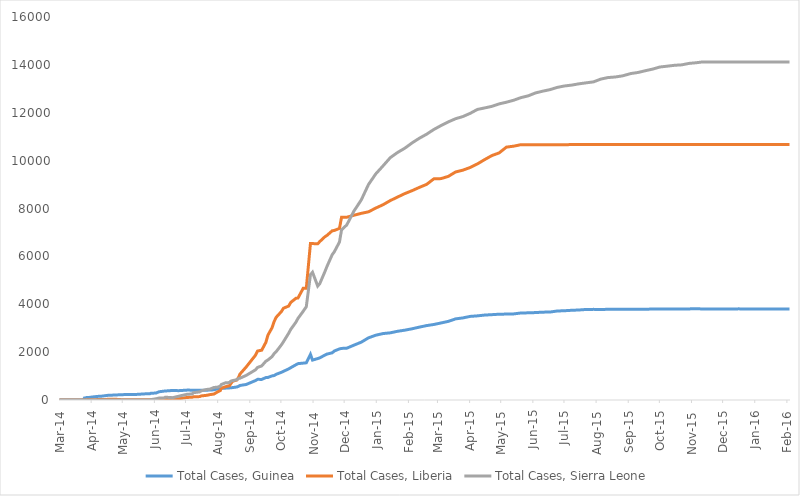
| Category | Total Cases, Guinea | Total Cases, Liberia | Total Cases, Sierra Leone |
|---|---|---|---|
| 2014-03-01 | 0 | 0 | 0 |
| 2014-03-02 | 0 | 0 | 0 |
| 2014-03-03 | 0 | 0 | 0 |
| 2014-03-04 | 0 | 0 | 0 |
| 2014-03-05 | 0 | 0 | 0 |
| 2014-03-06 | 0 | 0 | 0 |
| 2014-03-07 | 0 | 0 | 0 |
| 2014-03-08 | 0 | 0 | 0 |
| 2014-03-09 | 0 | 0 | 0 |
| 2014-03-10 | 0 | 0 | 0 |
| 2014-03-11 | 0 | 0 | 0 |
| 2014-03-12 | 0 | 0 | 0 |
| 2014-03-13 | 0 | 0 | 0 |
| 2014-03-14 | 0 | 0 | 0 |
| 2014-03-15 | 0 | 0 | 0 |
| 2014-03-16 | 0 | 0 | 0 |
| 2014-03-17 | 0 | 0 | 0 |
| 2014-03-18 | 0 | 0 | 0 |
| 2014-03-19 | 0 | 0 | 0 |
| 2014-03-20 | 0 | 0 | 0 |
| 2014-03-21 | 0 | 0 | 0 |
| 2014-03-22 | 0 | 0 | 0 |
| 2014-03-23 | 0 | 0 | 0 |
| 2014-03-24 | 0 | 0 | 0 |
| 2014-03-25 | 86 | 0 | 0 |
| 2014-03-26 | 86 | 0 | 0 |
| 2014-03-27 | 103 | 8 | 6 |
| 2014-03-31 | 112 | 8 | 0 |
| 2014-04-01 | 122 | 8 | 0 |
| 2014-04-02 | 127 | 8 | 0 |
| 2014-04-07 | 151 | 18 | 0 |
| 2014-04-10 | 157 | 22 | 0 |
| 2014-04-17 | 197 | 27 | 0 |
| 2014-04-21 | 203 | 27 | 0 |
| 2014-04-23 | 208 | 34 | 0 |
| 2014-04-30 | 221 | 13 | 0 |
| 2014-05-05 | 231 | 13 | 0 |
| 2014-05-14 | 233 | 12 | 0 |
| 2014-05-23 | 258 | 12 | 0 |
| 2014-05-27 | 258 | 12 | 1 |
| 2014-05-28 | 281 | 12 | 16 |
| 2014-06-02 | 291 | 13 | 50 |
| 2014-06-05 | 344 | 13 | 81 |
| 2014-06-10 | 372 | 15 | 89 |
| 2014-06-11 | 376 | 15 | 117 |
| 2014-06-18 | 398 | 33 | 97 |
| 2014-06-24 | 390 | 51 | 158 |
| 2014-07-02 | 413 | 107 | 239 |
| 2014-07-07 | 412 | 115 | 252 |
| 2014-07-08 | 408 | 131 | 305 |
| 2014-07-14 | 409 | 142 | 337 |
| 2014-07-16 | 406 | 172 | 386 |
| 2014-07-21 | 410 | 196 | 442 |
| 2014-07-24 | 415 | 224 | 454 |
| 2014-07-28 | 427 | 249 | 525 |
| 2014-07-31 | 460 | 329 | 533 |
| 2014-08-03 | 472 | 391 | 574 |
| 2014-08-04 | 485 | 486 | 646 |
| 2014-08-08 | 495 | 554 | 717 |
| 2014-08-12 | 506 | 599 | 730 |
| 2014-08-13 | 510 | 670 | 783 |
| 2014-08-15 | 519 | 786 | 810 |
| 2014-08-19 | 543 | 834 | 848 |
| 2014-08-21 | 579 | 972 | 907 |
| 2014-08-22 | 607 | 1082 | 910 |
| 2014-08-28 | 648 | 1378 | 1026 |
| 2014-09-06 | 812 | 1871 | 1261 |
| 2014-09-08 | 862 | 2046 | 1361 |
| 2014-09-12 | 861 | 2081 | 1424 |
| 2014-09-16 | 936 | 2407 | 1620 |
| 2014-09-18 | 942 | 2710 | 1673 |
| 2014-09-22 | 1008 | 3022 | 1813 |
| 2014-09-24 | 1022 | 3280 | 1940 |
| 2014-09-26 | 1074 | 3458 | 2021 |
| 2014-10-01 | 1157 | 3696 | 2304 |
| 2014-10-03 | 1199 | 3834 | 2437 |
| 2014-10-08 | 1298 | 3924 | 2789 |
| 2014-10-10 | 1350 | 4076 | 2950 |
| 2014-10-15 | 1472 | 4249 | 3252 |
| 2014-10-17 | 1519 | 4262 | 3410 |
| 2014-10-22 | 1540 | 4665 | 3706 |
| 2014-10-25 | 1553 | 4665 | 3896 |
| 2014-10-29 | 1906 | 6535 | 5235 |
| 2014-10-31 | 1667 | 6535 | 5338 |
| 2014-11-05 | 1731 | 6525 | 4759 |
| 2014-11-07 | 1760 | 6619 | 4862 |
| 2014-11-12 | 1878 | 6822 | 5368 |
| 2014-11-14 | 1919 | 6878 | 5586 |
| 2014-11-19 | 1971 | 7069 | 6073 |
| 2014-11-21 | 2047 | 7082 | 6190 |
| 2014-11-26 | 2134 | 7168 | 6599 |
| 2014-11-28 | 2155 | 7635 | 7109 |
| 2014-12-03 | 2164 | 7635 | 7312 |
| 2014-12-10 | 2292 | 7719 | 7897 |
| 2014-12-17 | 2416 | 7797 | 8356 |
| 2014-12-24 | 2597 | 7862 | 9004 |
| 2014-12-31 | 2707 | 8018 | 9446 |
| 2015-01-07 | 2775 | 8157 | 9780 |
| 2015-01-14 | 2806 | 8331 | 10124 |
| 2015-01-21 | 2871 | 8478 | 10340 |
| 2015-01-28 | 2917 | 8622 | 10518 |
| 2015-02-04 | 2975 | 8745 | 10740 |
| 2015-02-11 | 3044 | 8881 | 10934 |
| 2015-02-18 | 3108 | 9007 | 11103 |
| 2015-02-25 | 3155 | 9238 | 11301 |
| 2015-03-04 | 3219 | 9249 | 11466 |
| 2015-03-11 | 3285 | 9343 | 11619 |
| 2015-03-18 | 3389 | 9526 | 11751 |
| 2015-03-25 | 3429 | 9602 | 11841 |
| 2015-04-01 | 3492 | 9712 | 11974 |
| 2015-04-08 | 3515 | 9862 | 12138 |
| 2015-04-15 | 3548 | 10042 | 12201 |
| 2015-04-22 | 3565 | 10212 | 12267 |
| 2015-04-29 | 3584 | 10322 | 12371 |
| 2015-05-06 | 3589 | 10564 | 12440 |
| 2015-05-13 | 3597 | 10604 | 12523 |
| 2015-05-20 | 3635 | 10666 | 12632 |
| 2015-05-27 | 3641 | 10666 | 12706 |
| 2015-06-03 | 3652 | 10666 | 12827 |
| 2015-06-10 | 3670 | 10666 | 12901 |
| 2015-06-17 | 3674 | 10666 | 12965 |
| 2015-06-24 | 3718 | 10666 | 13059 |
| 2015-07-01 | 3729 | 10666 | 13119 |
| 2015-07-08 | 3748 | 10670 | 13155 |
| 2015-07-15 | 3760 | 10673 | 13209 |
| 2015-07-22 | 3783 | 10672 | 13250 |
| 2015-07-29 | 3786 | 10672 | 13290 |
| 2015-08-05 | 3784 | 10672 | 13406 |
| 2015-08-12 | 3787 | 10672 | 13470 |
| 2015-08-19 | 3786 | 10672 | 13494 |
| 2015-08-26 | 3792 | 10672 | 13541 |
| 2015-09-03 | 3792 | 10672 | 13638 |
| 2015-09-10 | 3792 | 10672 | 13683 |
| 2015-09-17 | 3792 | 10672 | 13756 |
| 2015-09-24 | 3800 | 10672 | 13823 |
| 2015-10-01 | 3805 | 10672 | 13911 |
| 2015-10-08 | 3804 | 10672 | 13945 |
| 2015-10-15 | 3800 | 10672 | 13982 |
| 2015-10-22 | 3803 | 10672 | 14001 |
| 2015-10-29 | 3806 | 10672 | 14061 |
| 2015-11-05 | 3810 | 10672 | 14089 |
| 2015-11-11 | 3805 | 10672 | 14122 |
| 2015-11-18 | 3804 | 10672 | 14122 |
| 2015-11-25 | 3804 | 10675 | 14122 |
| 2015-12-02 | 3804 | 10675 | 14122 |
| 2015-12-09 | 3804 | 10675 | 14122 |
| 2015-12-16 | 3807 | 10675 | 14122 |
| 2015-12-23 | 3804 | 10675 | 14122 |
| 2015-12-30 | 3804 | 10675 | 14122 |
| 2016-01-06 | 3804 | 10675 | 14122 |
| 2016-01-13 | 3804 | 10675 | 14122 |
| 2016-01-20 | 3804 | 10675 | 14123 |
| 2016-02-03 | 3804 | 10675 | 14124 |